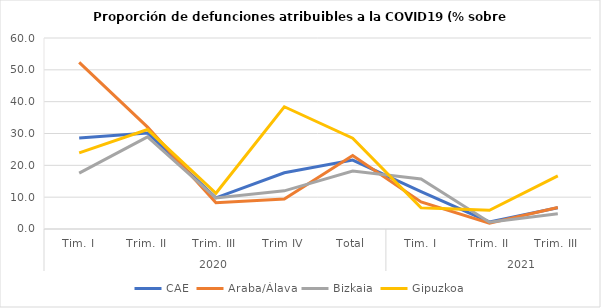
| Category | CAE | Araba/Álava | Bizkaia | Gipuzkoa |
|---|---|---|---|---|
| 0 | 28.62 | 52.326 | 17.576 | 23.913 |
| 1 | 30.168 | 32 | 28.933 | 31.237 |
| 2 | 9.789 | 8.235 | 9.726 | 11.215 |
| 3 | 17.673 | 9.434 | 11.982 | 38.403 |
| 4 | 21.636 | 23.077 | 18.212 | 28.543 |
| 5 | 11.769 | 8.497 | 15.735 | 6.697 |
| 6 | 2.239 | 1.852 | 2.11 | 5.882 |
| 7 | 6.65 | 6.757 | 4.804 | 16.667 |